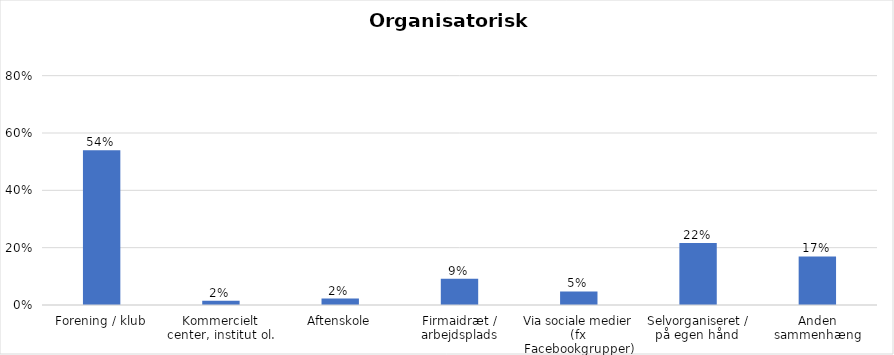
| Category | % |
|---|---|
| Forening / klub | 0.54 |
| Kommercielt center, institut ol. | 0.015 |
| Aftenskole | 0.023 |
| Firmaidræt / arbejdsplads | 0.092 |
| Via sociale medier (fx Facebookgrupper) | 0.047 |
| Selvorganiseret / på egen hånd  | 0.216 |
| Anden sammenhæng | 0.169 |